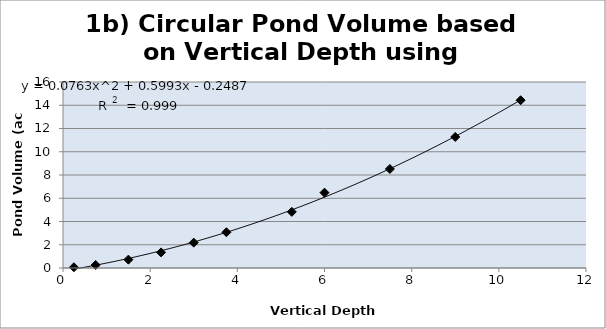
| Category | Series 0 |
|---|---|
| 0.25 | 0.064 |
| 0.75 | 0.258 |
| 1.5 | 0.72 |
| 2.25 | 1.343 |
| 3.0 | 2.181 |
| 3.75 | 3.078 |
| 5.25 | 4.83 |
| 6.0 | 6.479 |
| 7.5 | 8.519 |
| 9.0 | 11.271 |
| 10.5 | 14.432 |
| nan | 0 |